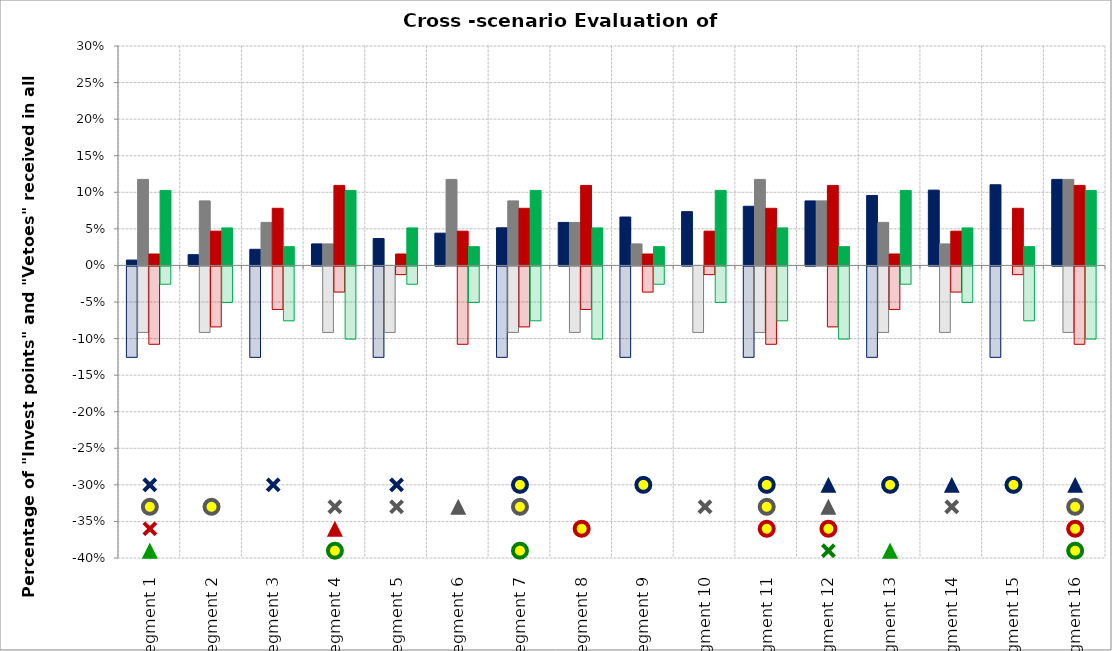
| Category | Global Marketplace (Y) | Millions of Markets (Y) | Naftastique! (Y) | One World Order (Y) |
|---|---|---|---|---|
| Segment 1 | 0.007 | 0.118 | 0.016 | 0.103 |
| Segment 2 | 0.015 | 0.088 | 0.047 | 0.051 |
| Segment 3 | 0.022 | 0.059 | 0.078 | 0.026 |
| Segment 4 | 0.029 | 0.029 | 0.109 | 0.103 |
| Segment 5 | 0.037 | 0 | 0.016 | 0.051 |
| Segment 6 | 0.044 | 0.118 | 0.047 | 0.026 |
| Segment 7 | 0.051 | 0.088 | 0.078 | 0.103 |
| Segment 8 | 0.059 | 0.059 | 0.109 | 0.051 |
| Segment 9 | 0.066 | 0.029 | 0.016 | 0.026 |
| Segment 10 | 0.074 | 0 | 0.047 | 0.103 |
| Segment 11 | 0.081 | 0.118 | 0.078 | 0.051 |
| Segment 12 | 0.088 | 0.088 | 0.109 | 0.026 |
| Segment 13 | 0.096 | 0.059 | 0.016 | 0.103 |
| Segment 14 | 0.103 | 0.029 | 0.047 | 0.051 |
| Segment 15 | 0.11 | 0 | 0.078 | 0.026 |
| Segment 16 | 0.118 | 0.118 | 0.109 | 0.103 |